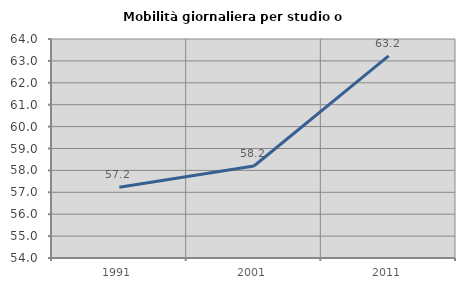
| Category | Mobilità giornaliera per studio o lavoro |
|---|---|
| 1991.0 | 57.23 |
| 2001.0 | 58.203 |
| 2011.0 | 63.227 |